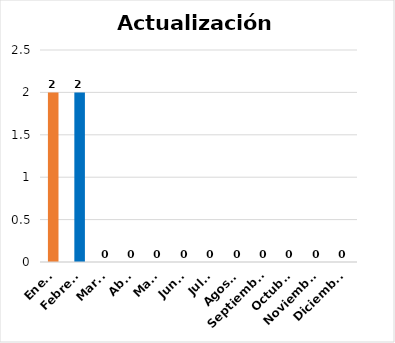
| Category | Actualización Documentos |
|---|---|
| Enero | 2 |
| Febrero | 2 |
| Marzo | 0 |
| Abril | 0 |
| Mayo | 0 |
| Junio | 0 |
| Julio | 0 |
| Agosto | 0 |
| Septiembre | 0 |
| Octubre | 0 |
| Noviembre | 0 |
| Diciembre | 0 |